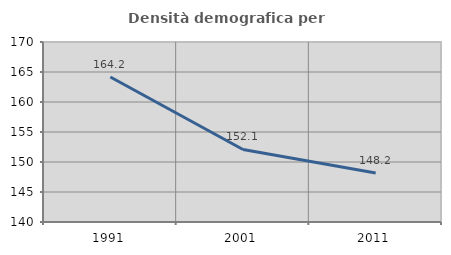
| Category | Densità demografica |
|---|---|
| 1991.0 | 164.175 |
| 2001.0 | 152.09 |
| 2011.0 | 148.151 |